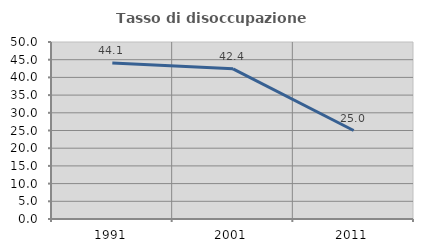
| Category | Tasso di disoccupazione giovanile  |
|---|---|
| 1991.0 | 44.068 |
| 2001.0 | 42.424 |
| 2011.0 | 25 |